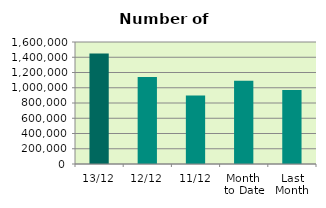
| Category | Series 0 |
|---|---|
| 13/12 | 1450724 |
| 12/12 | 1140408 |
| 11/12 | 898830 |
| Month 
to Date | 1092047 |
| Last
Month | 969317.238 |